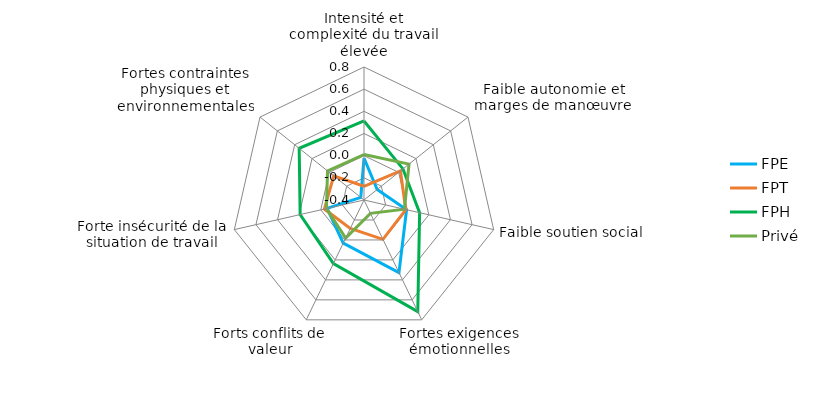
| Category | FPE | FPT | FPH | Privé |
|---|---|---|---|---|
| Intensité et complexité du travail élevée | -0.022 | -0.276 | 0.313 | 0.01 |
| Faible autonomie et marges de manœuvre | -0.248 | 0.021 | 0.05 | 0.119 |
| Faible soutien social | -0.006 | -0.013 | 0.115 | -0.026 |
| Fortes exigences émotionnelles | 0.327 | -0.006 | 0.718 | -0.267 |
| Forts conflits de valeur | 0.032 | -0.115 | 0.236 | -0.019 |
| Forte insécurité de la situation de travail | -0.059 | -0.033 | 0.191 | -0.053 |
| Fortes contraintes physiques et environnementales | -0.363 | -0.051 | 0.348 | 0.021 |